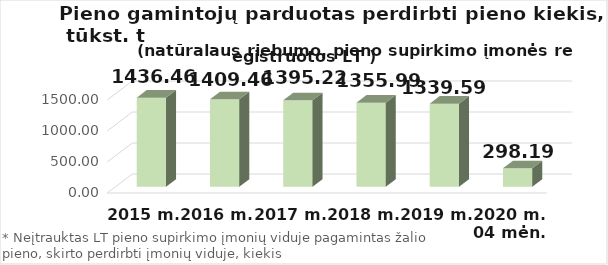
| Category | Lietuvos pieno supirkimo įmonėms* |
|---|---|
| 2015 m. | 1436.455 |
| 2016 m. | 1409.46 |
| 2017 m.  | 1395.224 |
| 2018 m.  | 1355.989 |
| 2019 m.  | 1339.59 |
| 2020 m. 04 mėn. | 298.19 |